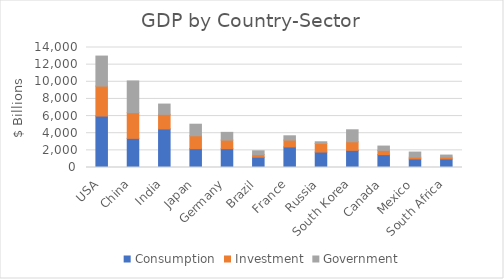
| Category | Consumption | Investment | Government |
|---|---|---|---|
| USA | 6000 | 3500 | 3500 |
| China | 3400 | 3000 | 3700 |
| India | 4500 | 1700 | 1200 |
| Japan | 2200 | 1500 | 1350 |
| Germany | 2200 | 1000 | 900 |
| Brazil | 1200 | 300 | 450 |
| France | 2400 | 800 | 500 |
| Russia | 1800 | 1000 | 200 |
| South Korea | 2000 | 1000 | 1400 |
| Canada | 1500 | 500 | 500 |
| Mexico | 1000 | 200 | 600 |
| South Africa | 1000 | 200 | 250 |